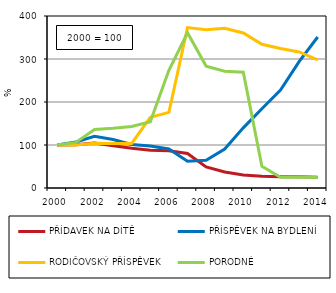
| Category | PŘÍDAVEK NA DÍTĚ | PŘÍSPĚVEK NA BYDLENÍ | RODIČOVSKÝ PŘÍSPĚVEK | PORODNÉ |
|---|---|---|---|---|
| 2000.0 | 100 | 100 | 100 | 100 |
| 2001.0 | 100.4 | 107.149 | 100.13 | 106.024 |
| 2002.0 | 104.746 | 120.254 | 104.304 | 136.145 |
| 2003.0 | 98.204 | 112.589 | 103.55 | 138.898 |
| 2004.0 | 92.485 | 101.191 | 103.55 | 143.201 |
| 2005.0 | 87.818 | 97.617 | 164.179 | 154.045 |
| 2006.0 | 86.547 | 90.826 | 175.868 | 273.838 |
| 2007.0 | 80.295 | 62.153 | 373.033 | 360.929 |
| 2008.0 | 48.886 | 64.297 | 367.885 | 283.477 |
| 2009.0 | 37.151 | 90.548 | 371.681 | 271.773 |
| 2010.0 | 30.295 | 139.833 | 360.447 | 269.363 |
| 2011.0 | 27.44 | 184.313 | 334.274 | 50.258 |
| 2012.0 | 26.137 | 227.641 | 324.405 | 24.785 |
| 2013.0 | 26.114 | 294.003 | 316.422 | 25.473 |
| 2014.0 | 25.157 | 351.191 | 297.92 | 24.613 |